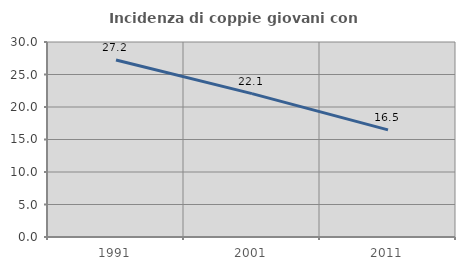
| Category | Incidenza di coppie giovani con figli |
|---|---|
| 1991.0 | 27.224 |
| 2001.0 | 22.057 |
| 2011.0 | 16.483 |